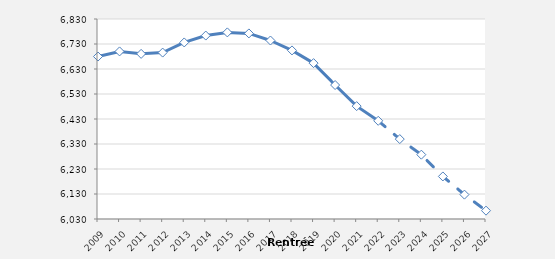
| Category | Series 0 |
|---|---|
| 2009.0 | 6679.822 |
| 2010.0 | 6700.335 |
| 2011.0 | 6690.547 |
| 2012.0 | 6695.679 |
| 2013.0 | 6736.22 |
| 2014.0 | 6763.717 |
| 2015.0 | 6776.398 |
| 2016.0 | 6772.329 |
| 2017.0 | 6743.962 |
| 2018.0 | 6704.319 |
| 2019.0 | 6653.465 |
| 2020.0 | 6565.847 |
| 2021.0 | 6481.517 |
| 2022.0 | 6422.791 |
| 2023.0 | 6349.615 |
| 2024.0 | 6287.355 |
| 2025.0 | 6200.25 |
| 2026.0 | 6127.551 |
| 2027.0 | 6063.434 |